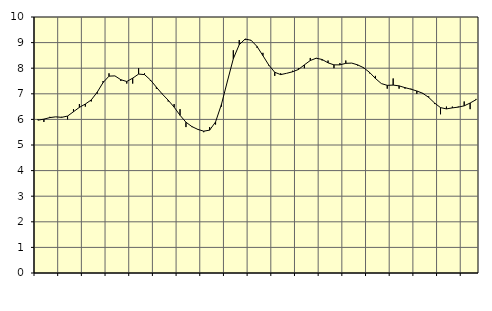
| Category | Piggar | Series 1 |
|---|---|---|
| nan | 6 | 5.97 |
| 1.0 | 5.9 | 6.01 |
| 1.0 | 6.1 | 6.07 |
| 1.0 | 6.1 | 6.1 |
| nan | 6.1 | 6.08 |
| 2.0 | 6 | 6.13 |
| 2.0 | 6.4 | 6.3 |
| 2.0 | 6.6 | 6.47 |
| nan | 6.5 | 6.6 |
| 3.0 | 6.7 | 6.76 |
| 3.0 | 7 | 7.06 |
| 3.0 | 7.5 | 7.44 |
| nan | 7.8 | 7.69 |
| 4.0 | 7.7 | 7.7 |
| 4.0 | 7.5 | 7.55 |
| 4.0 | 7.4 | 7.48 |
| nan | 7.4 | 7.61 |
| 5.0 | 8 | 7.77 |
| 5.0 | 7.8 | 7.75 |
| 5.0 | 7.5 | 7.54 |
| nan | 7.2 | 7.26 |
| 6.0 | 7 | 6.99 |
| 6.0 | 6.7 | 6.75 |
| 6.0 | 6.6 | 6.48 |
| nan | 6.4 | 6.16 |
| 7.0 | 5.7 | 5.89 |
| 7.0 | 5.7 | 5.72 |
| 7.0 | 5.6 | 5.61 |
| nan | 5.5 | 5.54 |
| 8.0 | 5.7 | 5.58 |
| 8.0 | 5.8 | 5.9 |
| 8.0 | 6.5 | 6.59 |
| nan | 7.5 | 7.49 |
| 9.0 | 8.7 | 8.37 |
| 9.0 | 9.1 | 8.92 |
| 9.0 | 9.1 | 9.14 |
| nan | 9.1 | 9.09 |
| 10.0 | 8.8 | 8.85 |
| 10.0 | 8.6 | 8.49 |
| 10.0 | 8.1 | 8.12 |
| nan | 7.7 | 7.84 |
| 11.0 | 7.8 | 7.75 |
| 11.0 | 7.8 | 7.8 |
| 11.0 | 7.9 | 7.86 |
| nan | 8 | 7.95 |
| 12.0 | 8 | 8.13 |
| 12.0 | 8.4 | 8.3 |
| 12.0 | 8.4 | 8.39 |
| nan | 8.3 | 8.34 |
| 13.0 | 8.3 | 8.21 |
| 13.0 | 8 | 8.13 |
| 13.0 | 8.2 | 8.13 |
| nan | 8.3 | 8.19 |
| 14.0 | 8.2 | 8.2 |
| 14.0 | 8.1 | 8.13 |
| 14.0 | 8 | 8.02 |
| nan | 7.8 | 7.84 |
| 15.0 | 7.7 | 7.6 |
| 15.0 | 7.4 | 7.4 |
| 15.0 | 7.2 | 7.33 |
| nan | 7.6 | 7.34 |
| 16.0 | 7.2 | 7.31 |
| 16.0 | 7.2 | 7.24 |
| 16.0 | 7.2 | 7.18 |
| nan | 7 | 7.11 |
| 17.0 | 7 | 7.02 |
| 17.0 | 6.9 | 6.86 |
| 17.0 | 6.6 | 6.64 |
| nan | 6.2 | 6.46 |
| 18.0 | 6.5 | 6.41 |
| 18.0 | 6.5 | 6.45 |
| 18.0 | 6.5 | 6.48 |
| nan | 6.7 | 6.53 |
| 19.0 | 6.4 | 6.64 |
| 19.0 | 6.8 | 6.77 |